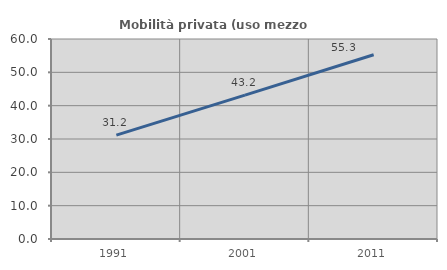
| Category | Mobilità privata (uso mezzo privato) |
|---|---|
| 1991.0 | 31.153 |
| 2001.0 | 43.156 |
| 2011.0 | 55.289 |